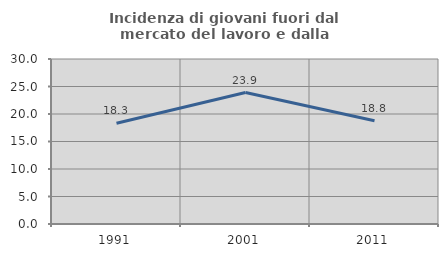
| Category | Incidenza di giovani fuori dal mercato del lavoro e dalla formazione  |
|---|---|
| 1991.0 | 18.313 |
| 2001.0 | 23.894 |
| 2011.0 | 18.757 |